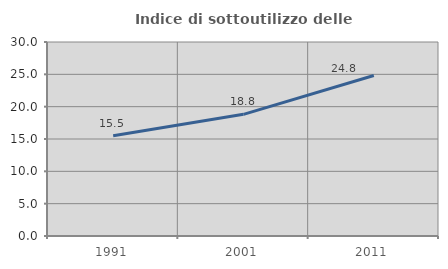
| Category | Indice di sottoutilizzo delle abitazioni  |
|---|---|
| 1991.0 | 15.493 |
| 2001.0 | 18.812 |
| 2011.0 | 24.818 |